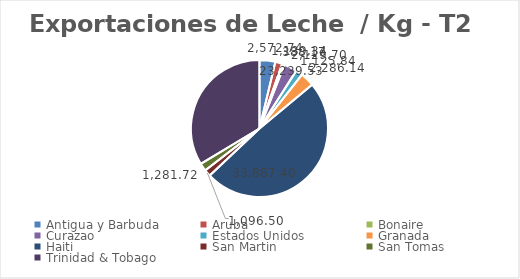
| Category | kg | Valor US  |
|---|---|---|
| Antigua y Barbuda | 2572.74 | 2871.24 |
| Aruba | 1139.34 | 1221.45 |
| Bonaire | 388.17 | 538.6 |
| Curazao | 2129.7 | 1868.6 |
| Estados Unidos | 1125.84 | 1157.24 |
| Granada | 2286.14 | 11453.82 |
| Haiti | 33887.399 | 279596.812 |
| San Martin | 1096.5 | 488.24 |
| San Tomas | 1281.72 | 1364.7 |
| Trinidad & Tobago | 23239.529 | 33595.259 |